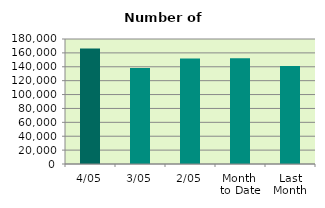
| Category | Series 0 |
|---|---|
| 4/05 | 166338 |
| 3/05 | 138340 |
| 2/05 | 151916 |
| Month 
to Date | 152198 |
| Last
Month | 140978.316 |